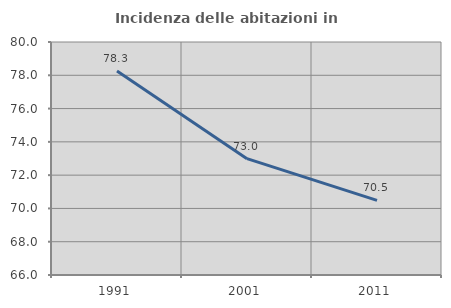
| Category | Incidenza delle abitazioni in proprietà  |
|---|---|
| 1991.0 | 78.261 |
| 2001.0 | 72.989 |
| 2011.0 | 70.482 |